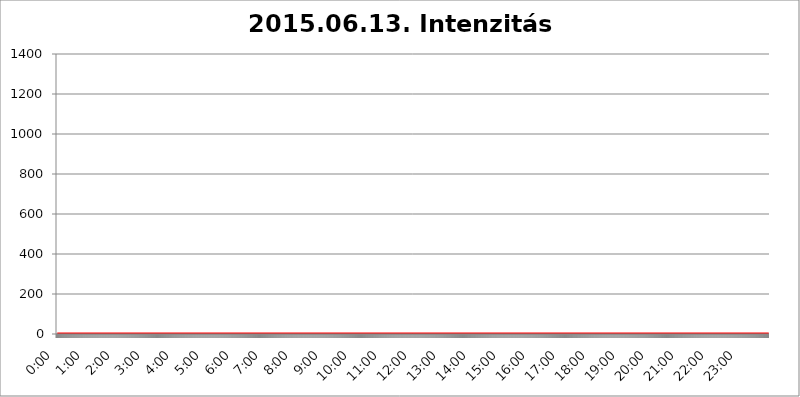
| Category | 2015.06.13. Intenzitás [W/m^2] |
|---|---|
| 0.0 | 0 |
| 0.0006944444444444445 | 0 |
| 0.001388888888888889 | 0 |
| 0.0020833333333333333 | 0 |
| 0.002777777777777778 | 0 |
| 0.003472222222222222 | 0 |
| 0.004166666666666667 | 0 |
| 0.004861111111111111 | 0 |
| 0.005555555555555556 | 0 |
| 0.0062499999999999995 | 0 |
| 0.006944444444444444 | 0 |
| 0.007638888888888889 | 0 |
| 0.008333333333333333 | 0 |
| 0.009027777777777779 | 0 |
| 0.009722222222222222 | 0 |
| 0.010416666666666666 | 0 |
| 0.011111111111111112 | 0 |
| 0.011805555555555555 | 0 |
| 0.012499999999999999 | 0 |
| 0.013194444444444444 | 0 |
| 0.013888888888888888 | 0 |
| 0.014583333333333332 | 0 |
| 0.015277777777777777 | 0 |
| 0.015972222222222224 | 0 |
| 0.016666666666666666 | 0 |
| 0.017361111111111112 | 0 |
| 0.018055555555555557 | 0 |
| 0.01875 | 0 |
| 0.019444444444444445 | 0 |
| 0.02013888888888889 | 0 |
| 0.020833333333333332 | 0 |
| 0.02152777777777778 | 0 |
| 0.022222222222222223 | 0 |
| 0.02291666666666667 | 0 |
| 0.02361111111111111 | 0 |
| 0.024305555555555556 | 0 |
| 0.024999999999999998 | 0 |
| 0.025694444444444447 | 0 |
| 0.02638888888888889 | 0 |
| 0.027083333333333334 | 0 |
| 0.027777777777777776 | 0 |
| 0.02847222222222222 | 0 |
| 0.029166666666666664 | 0 |
| 0.029861111111111113 | 0 |
| 0.030555555555555555 | 0 |
| 0.03125 | 0 |
| 0.03194444444444445 | 0 |
| 0.03263888888888889 | 0 |
| 0.03333333333333333 | 0 |
| 0.034027777777777775 | 0 |
| 0.034722222222222224 | 0 |
| 0.035416666666666666 | 0 |
| 0.036111111111111115 | 0 |
| 0.03680555555555556 | 0 |
| 0.0375 | 0 |
| 0.03819444444444444 | 0 |
| 0.03888888888888889 | 0 |
| 0.03958333333333333 | 0 |
| 0.04027777777777778 | 0 |
| 0.04097222222222222 | 0 |
| 0.041666666666666664 | 0 |
| 0.042361111111111106 | 0 |
| 0.04305555555555556 | 0 |
| 0.043750000000000004 | 0 |
| 0.044444444444444446 | 0 |
| 0.04513888888888889 | 0 |
| 0.04583333333333334 | 0 |
| 0.04652777777777778 | 0 |
| 0.04722222222222222 | 0 |
| 0.04791666666666666 | 0 |
| 0.04861111111111111 | 0 |
| 0.049305555555555554 | 0 |
| 0.049999999999999996 | 0 |
| 0.05069444444444445 | 0 |
| 0.051388888888888894 | 0 |
| 0.052083333333333336 | 0 |
| 0.05277777777777778 | 0 |
| 0.05347222222222222 | 0 |
| 0.05416666666666667 | 0 |
| 0.05486111111111111 | 0 |
| 0.05555555555555555 | 0 |
| 0.05625 | 0 |
| 0.05694444444444444 | 0 |
| 0.057638888888888885 | 0 |
| 0.05833333333333333 | 0 |
| 0.05902777777777778 | 0 |
| 0.059722222222222225 | 0 |
| 0.06041666666666667 | 0 |
| 0.061111111111111116 | 0 |
| 0.06180555555555556 | 0 |
| 0.0625 | 0 |
| 0.06319444444444444 | 0 |
| 0.06388888888888888 | 0 |
| 0.06458333333333334 | 0 |
| 0.06527777777777778 | 0 |
| 0.06597222222222222 | 0 |
| 0.06666666666666667 | 0 |
| 0.06736111111111111 | 0 |
| 0.06805555555555555 | 0 |
| 0.06874999999999999 | 0 |
| 0.06944444444444443 | 0 |
| 0.07013888888888889 | 0 |
| 0.07083333333333333 | 0 |
| 0.07152777777777779 | 0 |
| 0.07222222222222223 | 0 |
| 0.07291666666666667 | 0 |
| 0.07361111111111111 | 0 |
| 0.07430555555555556 | 0 |
| 0.075 | 0 |
| 0.07569444444444444 | 0 |
| 0.0763888888888889 | 0 |
| 0.07708333333333334 | 0 |
| 0.07777777777777778 | 0 |
| 0.07847222222222222 | 0 |
| 0.07916666666666666 | 0 |
| 0.0798611111111111 | 0 |
| 0.08055555555555556 | 0 |
| 0.08125 | 0 |
| 0.08194444444444444 | 0 |
| 0.08263888888888889 | 0 |
| 0.08333333333333333 | 0 |
| 0.08402777777777777 | 0 |
| 0.08472222222222221 | 0 |
| 0.08541666666666665 | 0 |
| 0.08611111111111112 | 0 |
| 0.08680555555555557 | 0 |
| 0.08750000000000001 | 0 |
| 0.08819444444444445 | 0 |
| 0.08888888888888889 | 0 |
| 0.08958333333333333 | 0 |
| 0.09027777777777778 | 0 |
| 0.09097222222222222 | 0 |
| 0.09166666666666667 | 0 |
| 0.09236111111111112 | 0 |
| 0.09305555555555556 | 0 |
| 0.09375 | 0 |
| 0.09444444444444444 | 0 |
| 0.09513888888888888 | 0 |
| 0.09583333333333333 | 0 |
| 0.09652777777777777 | 0 |
| 0.09722222222222222 | 0 |
| 0.09791666666666667 | 0 |
| 0.09861111111111111 | 0 |
| 0.09930555555555555 | 0 |
| 0.09999999999999999 | 0 |
| 0.10069444444444443 | 0 |
| 0.1013888888888889 | 0 |
| 0.10208333333333335 | 0 |
| 0.10277777777777779 | 0 |
| 0.10347222222222223 | 0 |
| 0.10416666666666667 | 0 |
| 0.10486111111111111 | 0 |
| 0.10555555555555556 | 0 |
| 0.10625 | 0 |
| 0.10694444444444444 | 0 |
| 0.1076388888888889 | 0 |
| 0.10833333333333334 | 0 |
| 0.10902777777777778 | 0 |
| 0.10972222222222222 | 0 |
| 0.1111111111111111 | 0 |
| 0.11180555555555556 | 0 |
| 0.11180555555555556 | 0 |
| 0.1125 | 0 |
| 0.11319444444444444 | 0 |
| 0.11388888888888889 | 0 |
| 0.11458333333333333 | 0 |
| 0.11527777777777777 | 0 |
| 0.11597222222222221 | 0 |
| 0.11666666666666665 | 0 |
| 0.1173611111111111 | 0 |
| 0.11805555555555557 | 0 |
| 0.11944444444444445 | 0 |
| 0.12013888888888889 | 0 |
| 0.12083333333333333 | 0 |
| 0.12152777777777778 | 0 |
| 0.12222222222222223 | 0 |
| 0.12291666666666667 | 0 |
| 0.12291666666666667 | 0 |
| 0.12361111111111112 | 0 |
| 0.12430555555555556 | 0 |
| 0.125 | 0 |
| 0.12569444444444444 | 0 |
| 0.12638888888888888 | 0 |
| 0.12708333333333333 | 0 |
| 0.16875 | 0 |
| 0.12847222222222224 | 0 |
| 0.12916666666666668 | 0 |
| 0.12986111111111112 | 0 |
| 0.13055555555555556 | 0 |
| 0.13125 | 0 |
| 0.13194444444444445 | 0 |
| 0.1326388888888889 | 0 |
| 0.13333333333333333 | 0 |
| 0.13402777777777777 | 0 |
| 0.13402777777777777 | 0 |
| 0.13472222222222222 | 0 |
| 0.13541666666666666 | 0 |
| 0.1361111111111111 | 0 |
| 0.13749999999999998 | 0 |
| 0.13819444444444443 | 0 |
| 0.1388888888888889 | 0 |
| 0.13958333333333334 | 0 |
| 0.14027777777777778 | 0 |
| 0.14097222222222222 | 0 |
| 0.14166666666666666 | 0 |
| 0.1423611111111111 | 0 |
| 0.14305555555555557 | 0 |
| 0.14375000000000002 | 0 |
| 0.14444444444444446 | 0 |
| 0.1451388888888889 | 0 |
| 0.1451388888888889 | 0 |
| 0.14652777777777778 | 0 |
| 0.14722222222222223 | 0 |
| 0.14791666666666667 | 0 |
| 0.1486111111111111 | 0 |
| 0.14930555555555555 | 0 |
| 0.15 | 0 |
| 0.15069444444444444 | 0 |
| 0.15138888888888888 | 0 |
| 0.15208333333333332 | 0 |
| 0.15277777777777776 | 0 |
| 0.15347222222222223 | 0 |
| 0.15416666666666667 | 0 |
| 0.15486111111111112 | 0 |
| 0.15555555555555556 | 0 |
| 0.15625 | 0 |
| 0.15694444444444444 | 0 |
| 0.15763888888888888 | 0 |
| 0.15833333333333333 | 0 |
| 0.15902777777777777 | 0 |
| 0.15972222222222224 | 0 |
| 0.16041666666666668 | 0 |
| 0.16111111111111112 | 0 |
| 0.16180555555555556 | 0 |
| 0.1625 | 0 |
| 0.16319444444444445 | 0 |
| 0.1638888888888889 | 0 |
| 0.16458333333333333 | 0 |
| 0.16527777777777777 | 0 |
| 0.16597222222222222 | 0 |
| 0.16666666666666666 | 0 |
| 0.1673611111111111 | 0 |
| 0.16805555555555554 | 0 |
| 0.16874999999999998 | 0 |
| 0.16944444444444443 | 0 |
| 0.17013888888888887 | 0 |
| 0.1708333333333333 | 0 |
| 0.17152777777777775 | 0 |
| 0.17222222222222225 | 0 |
| 0.1729166666666667 | 0 |
| 0.17361111111111113 | 0 |
| 0.17430555555555557 | 0 |
| 0.17500000000000002 | 0 |
| 0.17569444444444446 | 0 |
| 0.1763888888888889 | 0 |
| 0.17708333333333334 | 0 |
| 0.17777777777777778 | 0 |
| 0.17847222222222223 | 0 |
| 0.17916666666666667 | 0 |
| 0.1798611111111111 | 0 |
| 0.18055555555555555 | 0 |
| 0.18125 | 0 |
| 0.18194444444444444 | 0 |
| 0.1826388888888889 | 0 |
| 0.18333333333333335 | 0 |
| 0.1840277777777778 | 0 |
| 0.18472222222222223 | 0 |
| 0.18541666666666667 | 0 |
| 0.18611111111111112 | 0 |
| 0.18680555555555556 | 0 |
| 0.1875 | 0 |
| 0.18819444444444444 | 0 |
| 0.18888888888888888 | 0 |
| 0.18958333333333333 | 0 |
| 0.19027777777777777 | 0 |
| 0.1909722222222222 | 0 |
| 0.19166666666666665 | 0 |
| 0.19236111111111112 | 0 |
| 0.19305555555555554 | 0 |
| 0.19375 | 0 |
| 0.19444444444444445 | 0 |
| 0.1951388888888889 | 0 |
| 0.19583333333333333 | 0 |
| 0.19652777777777777 | 0 |
| 0.19722222222222222 | 0 |
| 0.19791666666666666 | 0 |
| 0.1986111111111111 | 0 |
| 0.19930555555555554 | 0 |
| 0.19999999999999998 | 0 |
| 0.20069444444444443 | 0 |
| 0.20138888888888887 | 0 |
| 0.2020833333333333 | 0 |
| 0.2027777777777778 | 0 |
| 0.2034722222222222 | 0 |
| 0.2041666666666667 | 0 |
| 0.20486111111111113 | 0 |
| 0.20555555555555557 | 0 |
| 0.20625000000000002 | 0 |
| 0.20694444444444446 | 0 |
| 0.2076388888888889 | 0 |
| 0.20833333333333334 | 0 |
| 0.20902777777777778 | 0 |
| 0.20972222222222223 | 0 |
| 0.21041666666666667 | 0 |
| 0.2111111111111111 | 0 |
| 0.21180555555555555 | 0 |
| 0.2125 | 0 |
| 0.21319444444444444 | 0 |
| 0.2138888888888889 | 0 |
| 0.21458333333333335 | 0 |
| 0.2152777777777778 | 0 |
| 0.21597222222222223 | 0 |
| 0.21666666666666667 | 0 |
| 0.21736111111111112 | 0 |
| 0.21805555555555556 | 0 |
| 0.21875 | 0 |
| 0.21944444444444444 | 0 |
| 0.22013888888888888 | 0 |
| 0.22083333333333333 | 0 |
| 0.22152777777777777 | 0 |
| 0.2222222222222222 | 0 |
| 0.22291666666666665 | 0 |
| 0.2236111111111111 | 0 |
| 0.22430555555555556 | 0 |
| 0.225 | 0 |
| 0.22569444444444445 | 0 |
| 0.2263888888888889 | 0 |
| 0.22708333333333333 | 0 |
| 0.22777777777777777 | 0 |
| 0.22847222222222222 | 0 |
| 0.22916666666666666 | 0 |
| 0.2298611111111111 | 0 |
| 0.23055555555555554 | 0 |
| 0.23124999999999998 | 0 |
| 0.23194444444444443 | 0 |
| 0.23263888888888887 | 0 |
| 0.2333333333333333 | 0 |
| 0.2340277777777778 | 0 |
| 0.2347222222222222 | 0 |
| 0.2354166666666667 | 0 |
| 0.23611111111111113 | 0 |
| 0.23680555555555557 | 0 |
| 0.23750000000000002 | 0 |
| 0.23819444444444446 | 0 |
| 0.2388888888888889 | 0 |
| 0.23958333333333334 | 0 |
| 0.24027777777777778 | 0 |
| 0.24097222222222223 | 0 |
| 0.24166666666666667 | 0 |
| 0.2423611111111111 | 0 |
| 0.24305555555555555 | 0 |
| 0.24375 | 0 |
| 0.24444444444444446 | 0 |
| 0.24513888888888888 | 0 |
| 0.24583333333333335 | 0 |
| 0.2465277777777778 | 0 |
| 0.24722222222222223 | 0 |
| 0.24791666666666667 | 0 |
| 0.24861111111111112 | 0 |
| 0.24930555555555556 | 0 |
| 0.25 | 0 |
| 0.25069444444444444 | 0 |
| 0.2513888888888889 | 0 |
| 0.2520833333333333 | 0 |
| 0.25277777777777777 | 0 |
| 0.2534722222222222 | 0 |
| 0.25416666666666665 | 0 |
| 0.2548611111111111 | 0 |
| 0.2555555555555556 | 0 |
| 0.25625000000000003 | 0 |
| 0.2569444444444445 | 0 |
| 0.2576388888888889 | 0 |
| 0.25833333333333336 | 0 |
| 0.2590277777777778 | 0 |
| 0.25972222222222224 | 0 |
| 0.2604166666666667 | 0 |
| 0.2611111111111111 | 0 |
| 0.26180555555555557 | 0 |
| 0.2625 | 0 |
| 0.26319444444444445 | 0 |
| 0.2638888888888889 | 0 |
| 0.26458333333333334 | 0 |
| 0.2652777777777778 | 0 |
| 0.2659722222222222 | 0 |
| 0.26666666666666666 | 0 |
| 0.2673611111111111 | 0 |
| 0.26805555555555555 | 0 |
| 0.26875 | 0 |
| 0.26944444444444443 | 0 |
| 0.2701388888888889 | 0 |
| 0.2708333333333333 | 0 |
| 0.27152777777777776 | 0 |
| 0.2722222222222222 | 0 |
| 0.27291666666666664 | 0 |
| 0.2736111111111111 | 0 |
| 0.2743055555555555 | 0 |
| 0.27499999999999997 | 0 |
| 0.27569444444444446 | 0 |
| 0.27638888888888885 | 0 |
| 0.27708333333333335 | 0 |
| 0.2777777777777778 | 0 |
| 0.27847222222222223 | 0 |
| 0.2791666666666667 | 0 |
| 0.2798611111111111 | 0 |
| 0.28055555555555556 | 0 |
| 0.28125 | 0 |
| 0.28194444444444444 | 0 |
| 0.2826388888888889 | 0 |
| 0.2833333333333333 | 0 |
| 0.28402777777777777 | 0 |
| 0.2847222222222222 | 0 |
| 0.28541666666666665 | 0 |
| 0.28611111111111115 | 0 |
| 0.28680555555555554 | 0 |
| 0.28750000000000003 | 0 |
| 0.2881944444444445 | 0 |
| 0.2888888888888889 | 0 |
| 0.28958333333333336 | 0 |
| 0.2902777777777778 | 0 |
| 0.29097222222222224 | 0 |
| 0.2916666666666667 | 0 |
| 0.2923611111111111 | 0 |
| 0.29305555555555557 | 0 |
| 0.29375 | 0 |
| 0.29444444444444445 | 0 |
| 0.2951388888888889 | 0 |
| 0.29583333333333334 | 0 |
| 0.2965277777777778 | 0 |
| 0.2972222222222222 | 0 |
| 0.29791666666666666 | 0 |
| 0.2986111111111111 | 0 |
| 0.29930555555555555 | 0 |
| 0.3 | 0 |
| 0.30069444444444443 | 0 |
| 0.3013888888888889 | 0 |
| 0.3020833333333333 | 0 |
| 0.30277777777777776 | 0 |
| 0.3034722222222222 | 0 |
| 0.30416666666666664 | 0 |
| 0.3048611111111111 | 0 |
| 0.3055555555555555 | 0 |
| 0.30624999999999997 | 0 |
| 0.3069444444444444 | 0 |
| 0.3076388888888889 | 0 |
| 0.30833333333333335 | 0 |
| 0.3090277777777778 | 0 |
| 0.30972222222222223 | 0 |
| 0.3104166666666667 | 0 |
| 0.3111111111111111 | 0 |
| 0.31180555555555556 | 0 |
| 0.3125 | 0 |
| 0.31319444444444444 | 0 |
| 0.3138888888888889 | 0 |
| 0.3145833333333333 | 0 |
| 0.31527777777777777 | 0 |
| 0.3159722222222222 | 0 |
| 0.31666666666666665 | 0 |
| 0.31736111111111115 | 0 |
| 0.31805555555555554 | 0 |
| 0.31875000000000003 | 0 |
| 0.3194444444444445 | 0 |
| 0.3201388888888889 | 0 |
| 0.32083333333333336 | 0 |
| 0.3215277777777778 | 0 |
| 0.32222222222222224 | 0 |
| 0.3229166666666667 | 0 |
| 0.3236111111111111 | 0 |
| 0.32430555555555557 | 0 |
| 0.325 | 0 |
| 0.32569444444444445 | 0 |
| 0.3263888888888889 | 0 |
| 0.32708333333333334 | 0 |
| 0.3277777777777778 | 0 |
| 0.3284722222222222 | 0 |
| 0.32916666666666666 | 0 |
| 0.3298611111111111 | 0 |
| 0.33055555555555555 | 0 |
| 0.33125 | 0 |
| 0.33194444444444443 | 0 |
| 0.3326388888888889 | 0 |
| 0.3333333333333333 | 0 |
| 0.3340277777777778 | 0 |
| 0.3347222222222222 | 0 |
| 0.3354166666666667 | 0 |
| 0.3361111111111111 | 0 |
| 0.3368055555555556 | 0 |
| 0.33749999999999997 | 0 |
| 0.33819444444444446 | 0 |
| 0.33888888888888885 | 0 |
| 0.33958333333333335 | 0 |
| 0.34027777777777773 | 0 |
| 0.34097222222222223 | 0 |
| 0.3416666666666666 | 0 |
| 0.3423611111111111 | 0 |
| 0.3430555555555555 | 0 |
| 0.34375 | 0 |
| 0.3444444444444445 | 0 |
| 0.3451388888888889 | 0 |
| 0.3458333333333334 | 0 |
| 0.34652777777777777 | 0 |
| 0.34722222222222227 | 0 |
| 0.34791666666666665 | 0 |
| 0.34861111111111115 | 0 |
| 0.34930555555555554 | 0 |
| 0.35000000000000003 | 0 |
| 0.3506944444444444 | 0 |
| 0.3513888888888889 | 0 |
| 0.3520833333333333 | 0 |
| 0.3527777777777778 | 0 |
| 0.3534722222222222 | 0 |
| 0.3541666666666667 | 0 |
| 0.3548611111111111 | 0 |
| 0.35555555555555557 | 0 |
| 0.35625 | 0 |
| 0.35694444444444445 | 0 |
| 0.3576388888888889 | 0 |
| 0.35833333333333334 | 0 |
| 0.3590277777777778 | 0 |
| 0.3597222222222222 | 0 |
| 0.36041666666666666 | 0 |
| 0.3611111111111111 | 0 |
| 0.36180555555555555 | 0 |
| 0.3625 | 0 |
| 0.36319444444444443 | 0 |
| 0.3638888888888889 | 0 |
| 0.3645833333333333 | 0 |
| 0.3652777777777778 | 0 |
| 0.3659722222222222 | 0 |
| 0.3666666666666667 | 0 |
| 0.3673611111111111 | 0 |
| 0.3680555555555556 | 0 |
| 0.36874999999999997 | 0 |
| 0.36944444444444446 | 0 |
| 0.37013888888888885 | 0 |
| 0.37083333333333335 | 0 |
| 0.37152777777777773 | 0 |
| 0.37222222222222223 | 0 |
| 0.3729166666666666 | 0 |
| 0.3736111111111111 | 0 |
| 0.3743055555555555 | 0 |
| 0.375 | 0 |
| 0.3756944444444445 | 0 |
| 0.3763888888888889 | 0 |
| 0.3770833333333334 | 0 |
| 0.37777777777777777 | 0 |
| 0.37847222222222227 | 0 |
| 0.37916666666666665 | 0 |
| 0.37986111111111115 | 0 |
| 0.38055555555555554 | 0 |
| 0.38125000000000003 | 0 |
| 0.3819444444444444 | 0 |
| 0.3826388888888889 | 0 |
| 0.3833333333333333 | 0 |
| 0.3840277777777778 | 0 |
| 0.3847222222222222 | 0 |
| 0.3854166666666667 | 0 |
| 0.3861111111111111 | 0 |
| 0.38680555555555557 | 0 |
| 0.3875 | 0 |
| 0.38819444444444445 | 0 |
| 0.3888888888888889 | 0 |
| 0.38958333333333334 | 0 |
| 0.3902777777777778 | 0 |
| 0.3909722222222222 | 0 |
| 0.39166666666666666 | 0 |
| 0.3923611111111111 | 0 |
| 0.39305555555555555 | 0 |
| 0.39375 | 0 |
| 0.39444444444444443 | 0 |
| 0.3951388888888889 | 0 |
| 0.3958333333333333 | 0 |
| 0.3965277777777778 | 0 |
| 0.3972222222222222 | 0 |
| 0.3979166666666667 | 0 |
| 0.3986111111111111 | 0 |
| 0.3993055555555556 | 0 |
| 0.39999999999999997 | 0 |
| 0.40069444444444446 | 0 |
| 0.40138888888888885 | 0 |
| 0.40208333333333335 | 0 |
| 0.40277777777777773 | 0 |
| 0.40347222222222223 | 0 |
| 0.4041666666666666 | 0 |
| 0.4048611111111111 | 0 |
| 0.4055555555555555 | 0 |
| 0.40625 | 0 |
| 0.4069444444444445 | 0 |
| 0.4076388888888889 | 0 |
| 0.4083333333333334 | 0 |
| 0.40902777777777777 | 0 |
| 0.40972222222222227 | 0 |
| 0.41041666666666665 | 0 |
| 0.41111111111111115 | 0 |
| 0.41180555555555554 | 0 |
| 0.41250000000000003 | 0 |
| 0.4131944444444444 | 0 |
| 0.4138888888888889 | 0 |
| 0.4145833333333333 | 0 |
| 0.4152777777777778 | 0 |
| 0.4159722222222222 | 0 |
| 0.4166666666666667 | 0 |
| 0.4173611111111111 | 0 |
| 0.41805555555555557 | 0 |
| 0.41875 | 0 |
| 0.41944444444444445 | 0 |
| 0.4201388888888889 | 0 |
| 0.42083333333333334 | 0 |
| 0.4215277777777778 | 0 |
| 0.4222222222222222 | 0 |
| 0.42291666666666666 | 0 |
| 0.4236111111111111 | 0 |
| 0.42430555555555555 | 0 |
| 0.425 | 0 |
| 0.42569444444444443 | 0 |
| 0.4263888888888889 | 0 |
| 0.4270833333333333 | 0 |
| 0.4277777777777778 | 0 |
| 0.4284722222222222 | 0 |
| 0.4291666666666667 | 0 |
| 0.4298611111111111 | 0 |
| 0.4305555555555556 | 0 |
| 0.43124999999999997 | 0 |
| 0.43194444444444446 | 0 |
| 0.43263888888888885 | 0 |
| 0.43333333333333335 | 0 |
| 0.43402777777777773 | 0 |
| 0.43472222222222223 | 0 |
| 0.4354166666666666 | 0 |
| 0.4361111111111111 | 0 |
| 0.4368055555555555 | 0 |
| 0.4375 | 0 |
| 0.4381944444444445 | 0 |
| 0.4388888888888889 | 0 |
| 0.4395833333333334 | 0 |
| 0.44027777777777777 | 0 |
| 0.44097222222222227 | 0 |
| 0.44166666666666665 | 0 |
| 0.44236111111111115 | 0 |
| 0.44305555555555554 | 0 |
| 0.44375000000000003 | 0 |
| 0.4444444444444444 | 0 |
| 0.4451388888888889 | 0 |
| 0.4458333333333333 | 0 |
| 0.4465277777777778 | 0 |
| 0.4472222222222222 | 0 |
| 0.4479166666666667 | 0 |
| 0.4486111111111111 | 0 |
| 0.44930555555555557 | 0 |
| 0.45 | 0 |
| 0.45069444444444445 | 0 |
| 0.4513888888888889 | 0 |
| 0.45208333333333334 | 0 |
| 0.4527777777777778 | 0 |
| 0.4534722222222222 | 0 |
| 0.45416666666666666 | 0 |
| 0.4548611111111111 | 0 |
| 0.45555555555555555 | 0 |
| 0.45625 | 0 |
| 0.45694444444444443 | 0 |
| 0.4576388888888889 | 0 |
| 0.4583333333333333 | 0 |
| 0.4590277777777778 | 0 |
| 0.4597222222222222 | 0 |
| 0.4604166666666667 | 0 |
| 0.4611111111111111 | 0 |
| 0.4618055555555556 | 0 |
| 0.46249999999999997 | 0 |
| 0.46319444444444446 | 0 |
| 0.46388888888888885 | 0 |
| 0.46458333333333335 | 0 |
| 0.46527777777777773 | 0 |
| 0.46597222222222223 | 0 |
| 0.4666666666666666 | 0 |
| 0.4673611111111111 | 0 |
| 0.4680555555555555 | 0 |
| 0.46875 | 0 |
| 0.4694444444444445 | 0 |
| 0.4701388888888889 | 0 |
| 0.4708333333333334 | 0 |
| 0.47152777777777777 | 0 |
| 0.47222222222222227 | 0 |
| 0.47291666666666665 | 0 |
| 0.47361111111111115 | 0 |
| 0.47430555555555554 | 0 |
| 0.47500000000000003 | 0 |
| 0.4756944444444444 | 0 |
| 0.4763888888888889 | 0 |
| 0.4770833333333333 | 0 |
| 0.4777777777777778 | 0 |
| 0.4784722222222222 | 0 |
| 0.4791666666666667 | 0 |
| 0.4798611111111111 | 0 |
| 0.48055555555555557 | 0 |
| 0.48125 | 0 |
| 0.48194444444444445 | 0 |
| 0.4826388888888889 | 0 |
| 0.48333333333333334 | 0 |
| 0.4840277777777778 | 0 |
| 0.4847222222222222 | 0 |
| 0.48541666666666666 | 0 |
| 0.4861111111111111 | 0 |
| 0.48680555555555555 | 0 |
| 0.4875 | 0 |
| 0.48819444444444443 | 0 |
| 0.4888888888888889 | 0 |
| 0.4895833333333333 | 0 |
| 0.4902777777777778 | 0 |
| 0.4909722222222222 | 0 |
| 0.4916666666666667 | 0 |
| 0.4923611111111111 | 0 |
| 0.4930555555555556 | 0 |
| 0.49374999999999997 | 0 |
| 0.49444444444444446 | 0 |
| 0.49513888888888885 | 0 |
| 0.49583333333333335 | 0 |
| 0.49652777777777773 | 0 |
| 0.49722222222222223 | 0 |
| 0.4979166666666666 | 0 |
| 0.4986111111111111 | 0 |
| 0.4993055555555555 | 0 |
| 0.5 | 0 |
| 0.5006944444444444 | 0 |
| 0.5013888888888889 | 0 |
| 0.5020833333333333 | 0 |
| 0.5027777777777778 | 0 |
| 0.5034722222222222 | 0 |
| 0.5041666666666667 | 0 |
| 0.5048611111111111 | 0 |
| 0.5055555555555555 | 0 |
| 0.50625 | 0 |
| 0.5069444444444444 | 0 |
| 0.5076388888888889 | 0 |
| 0.5083333333333333 | 0 |
| 0.5090277777777777 | 0 |
| 0.5097222222222222 | 0 |
| 0.5104166666666666 | 0 |
| 0.5111111111111112 | 0 |
| 0.5118055555555555 | 0 |
| 0.5125000000000001 | 0 |
| 0.5131944444444444 | 0 |
| 0.513888888888889 | 0 |
| 0.5145833333333333 | 0 |
| 0.5152777777777778 | 0 |
| 0.5159722222222222 | 0 |
| 0.5166666666666667 | 0 |
| 0.517361111111111 | 0 |
| 0.5180555555555556 | 0 |
| 0.5187499999999999 | 0 |
| 0.5194444444444445 | 0 |
| 0.5201388888888888 | 0 |
| 0.5208333333333334 | 0 |
| 0.5215277777777778 | 0 |
| 0.5222222222222223 | 0 |
| 0.5229166666666667 | 0 |
| 0.5236111111111111 | 0 |
| 0.5243055555555556 | 0 |
| 0.525 | 0 |
| 0.5256944444444445 | 0 |
| 0.5263888888888889 | 0 |
| 0.5270833333333333 | 0 |
| 0.5277777777777778 | 0 |
| 0.5284722222222222 | 0 |
| 0.5291666666666667 | 0 |
| 0.5298611111111111 | 0 |
| 0.5305555555555556 | 0 |
| 0.53125 | 0 |
| 0.5319444444444444 | 0 |
| 0.5326388888888889 | 0 |
| 0.5333333333333333 | 0 |
| 0.5340277777777778 | 0 |
| 0.5347222222222222 | 0 |
| 0.5354166666666667 | 0 |
| 0.5361111111111111 | 0 |
| 0.5368055555555555 | 0 |
| 0.5375 | 0 |
| 0.5381944444444444 | 0 |
| 0.5388888888888889 | 0 |
| 0.5395833333333333 | 0 |
| 0.5402777777777777 | 0 |
| 0.5409722222222222 | 0 |
| 0.5416666666666666 | 0 |
| 0.5423611111111112 | 0 |
| 0.5430555555555555 | 0 |
| 0.5437500000000001 | 0 |
| 0.5444444444444444 | 0 |
| 0.545138888888889 | 0 |
| 0.5458333333333333 | 0 |
| 0.5465277777777778 | 0 |
| 0.5472222222222222 | 0 |
| 0.5479166666666667 | 0 |
| 0.548611111111111 | 0 |
| 0.5493055555555556 | 0 |
| 0.5499999999999999 | 0 |
| 0.5506944444444445 | 0 |
| 0.5513888888888888 | 0 |
| 0.5520833333333334 | 0 |
| 0.5527777777777778 | 0 |
| 0.5534722222222223 | 0 |
| 0.5541666666666667 | 0 |
| 0.5548611111111111 | 0 |
| 0.5555555555555556 | 0 |
| 0.55625 | 0 |
| 0.5569444444444445 | 0 |
| 0.5576388888888889 | 0 |
| 0.5583333333333333 | 0 |
| 0.5590277777777778 | 0 |
| 0.5597222222222222 | 0 |
| 0.5604166666666667 | 0 |
| 0.5611111111111111 | 0 |
| 0.5618055555555556 | 0 |
| 0.5625 | 0 |
| 0.5631944444444444 | 0 |
| 0.5638888888888889 | 0 |
| 0.5645833333333333 | 0 |
| 0.5652777777777778 | 0 |
| 0.5659722222222222 | 0 |
| 0.5666666666666667 | 0 |
| 0.5673611111111111 | 0 |
| 0.5680555555555555 | 0 |
| 0.56875 | 0 |
| 0.5694444444444444 | 0 |
| 0.5701388888888889 | 0 |
| 0.5708333333333333 | 0 |
| 0.5715277777777777 | 0 |
| 0.5722222222222222 | 0 |
| 0.5729166666666666 | 0 |
| 0.5736111111111112 | 0 |
| 0.5743055555555555 | 0 |
| 0.5750000000000001 | 0 |
| 0.5756944444444444 | 0 |
| 0.576388888888889 | 0 |
| 0.5770833333333333 | 0 |
| 0.5777777777777778 | 0 |
| 0.5784722222222222 | 0 |
| 0.5791666666666667 | 0 |
| 0.579861111111111 | 0 |
| 0.5805555555555556 | 0 |
| 0.5812499999999999 | 0 |
| 0.5819444444444445 | 0 |
| 0.5826388888888888 | 0 |
| 0.5833333333333334 | 0 |
| 0.5840277777777778 | 0 |
| 0.5847222222222223 | 0 |
| 0.5854166666666667 | 0 |
| 0.5861111111111111 | 0 |
| 0.5868055555555556 | 0 |
| 0.5875 | 0 |
| 0.5881944444444445 | 0 |
| 0.5888888888888889 | 0 |
| 0.5895833333333333 | 0 |
| 0.5902777777777778 | 0 |
| 0.5909722222222222 | 0 |
| 0.5916666666666667 | 0 |
| 0.5923611111111111 | 0 |
| 0.5930555555555556 | 0 |
| 0.59375 | 0 |
| 0.5944444444444444 | 0 |
| 0.5951388888888889 | 0 |
| 0.5958333333333333 | 0 |
| 0.5965277777777778 | 0 |
| 0.5972222222222222 | 0 |
| 0.5979166666666667 | 0 |
| 0.5986111111111111 | 0 |
| 0.5993055555555555 | 0 |
| 0.6 | 0 |
| 0.6006944444444444 | 0 |
| 0.6013888888888889 | 0 |
| 0.6020833333333333 | 0 |
| 0.6027777777777777 | 0 |
| 0.6034722222222222 | 0 |
| 0.6041666666666666 | 0 |
| 0.6048611111111112 | 0 |
| 0.6055555555555555 | 0 |
| 0.6062500000000001 | 0 |
| 0.6069444444444444 | 0 |
| 0.607638888888889 | 0 |
| 0.6083333333333333 | 0 |
| 0.6090277777777778 | 0 |
| 0.6097222222222222 | 0 |
| 0.6104166666666667 | 0 |
| 0.611111111111111 | 0 |
| 0.6118055555555556 | 0 |
| 0.6124999999999999 | 0 |
| 0.6131944444444445 | 0 |
| 0.6138888888888888 | 0 |
| 0.6145833333333334 | 0 |
| 0.6152777777777778 | 0 |
| 0.6159722222222223 | 0 |
| 0.6166666666666667 | 0 |
| 0.6173611111111111 | 0 |
| 0.6180555555555556 | 0 |
| 0.61875 | 0 |
| 0.6194444444444445 | 0 |
| 0.6201388888888889 | 0 |
| 0.6208333333333333 | 0 |
| 0.6215277777777778 | 0 |
| 0.6222222222222222 | 0 |
| 0.6229166666666667 | 0 |
| 0.6236111111111111 | 0 |
| 0.6243055555555556 | 0 |
| 0.625 | 0 |
| 0.6256944444444444 | 0 |
| 0.6263888888888889 | 0 |
| 0.6270833333333333 | 0 |
| 0.6277777777777778 | 0 |
| 0.6284722222222222 | 0 |
| 0.6291666666666667 | 0 |
| 0.6298611111111111 | 0 |
| 0.6305555555555555 | 0 |
| 0.63125 | 0 |
| 0.6319444444444444 | 0 |
| 0.6326388888888889 | 0 |
| 0.6333333333333333 | 0 |
| 0.6340277777777777 | 0 |
| 0.6347222222222222 | 0 |
| 0.6354166666666666 | 0 |
| 0.6361111111111112 | 0 |
| 0.6368055555555555 | 0 |
| 0.6375000000000001 | 0 |
| 0.6381944444444444 | 0 |
| 0.638888888888889 | 0 |
| 0.6395833333333333 | 0 |
| 0.6402777777777778 | 0 |
| 0.6409722222222222 | 0 |
| 0.6416666666666667 | 0 |
| 0.642361111111111 | 0 |
| 0.6430555555555556 | 0 |
| 0.6437499999999999 | 0 |
| 0.6444444444444445 | 0 |
| 0.6451388888888888 | 0 |
| 0.6458333333333334 | 0 |
| 0.6465277777777778 | 0 |
| 0.6472222222222223 | 0 |
| 0.6479166666666667 | 0 |
| 0.6486111111111111 | 0 |
| 0.6493055555555556 | 0 |
| 0.65 | 0 |
| 0.6506944444444445 | 0 |
| 0.6513888888888889 | 0 |
| 0.6520833333333333 | 0 |
| 0.6527777777777778 | 0 |
| 0.6534722222222222 | 0 |
| 0.6541666666666667 | 0 |
| 0.6548611111111111 | 0 |
| 0.6555555555555556 | 0 |
| 0.65625 | 0 |
| 0.6569444444444444 | 0 |
| 0.6576388888888889 | 0 |
| 0.6583333333333333 | 0 |
| 0.6590277777777778 | 0 |
| 0.6597222222222222 | 0 |
| 0.6604166666666667 | 0 |
| 0.6611111111111111 | 0 |
| 0.6618055555555555 | 0 |
| 0.6625 | 0 |
| 0.6631944444444444 | 0 |
| 0.6638888888888889 | 0 |
| 0.6645833333333333 | 0 |
| 0.6652777777777777 | 0 |
| 0.6659722222222222 | 0 |
| 0.6666666666666666 | 0 |
| 0.6673611111111111 | 0 |
| 0.6680555555555556 | 0 |
| 0.6687500000000001 | 0 |
| 0.6694444444444444 | 0 |
| 0.6701388888888888 | 0 |
| 0.6708333333333334 | 0 |
| 0.6715277777777778 | 0 |
| 0.6722222222222222 | 0 |
| 0.6729166666666666 | 0 |
| 0.6736111111111112 | 0 |
| 0.6743055555555556 | 0 |
| 0.6749999999999999 | 0 |
| 0.6756944444444444 | 0 |
| 0.6763888888888889 | 0 |
| 0.6770833333333334 | 0 |
| 0.6777777777777777 | 0 |
| 0.6784722222222223 | 0 |
| 0.6791666666666667 | 0 |
| 0.6798611111111111 | 0 |
| 0.6805555555555555 | 0 |
| 0.68125 | 0 |
| 0.6819444444444445 | 0 |
| 0.6826388888888889 | 0 |
| 0.6833333333333332 | 0 |
| 0.6840277777777778 | 0 |
| 0.6847222222222222 | 0 |
| 0.6854166666666667 | 0 |
| 0.686111111111111 | 0 |
| 0.6868055555555556 | 0 |
| 0.6875 | 0 |
| 0.6881944444444444 | 0 |
| 0.688888888888889 | 0 |
| 0.6895833333333333 | 0 |
| 0.6902777777777778 | 0 |
| 0.6909722222222222 | 0 |
| 0.6916666666666668 | 0 |
| 0.6923611111111111 | 0 |
| 0.6930555555555555 | 0 |
| 0.69375 | 0 |
| 0.6944444444444445 | 0 |
| 0.6951388888888889 | 0 |
| 0.6958333333333333 | 0 |
| 0.6965277777777777 | 0 |
| 0.6972222222222223 | 0 |
| 0.6979166666666666 | 0 |
| 0.6986111111111111 | 0 |
| 0.6993055555555556 | 0 |
| 0.7000000000000001 | 0 |
| 0.7006944444444444 | 0 |
| 0.7013888888888888 | 0 |
| 0.7020833333333334 | 0 |
| 0.7027777777777778 | 0 |
| 0.7034722222222222 | 0 |
| 0.7041666666666666 | 0 |
| 0.7048611111111112 | 0 |
| 0.7055555555555556 | 0 |
| 0.7062499999999999 | 0 |
| 0.7069444444444444 | 0 |
| 0.7076388888888889 | 0 |
| 0.7083333333333334 | 0 |
| 0.7090277777777777 | 0 |
| 0.7097222222222223 | 0 |
| 0.7104166666666667 | 0 |
| 0.7111111111111111 | 0 |
| 0.7118055555555555 | 0 |
| 0.7125 | 0 |
| 0.7131944444444445 | 0 |
| 0.7138888888888889 | 0 |
| 0.7145833333333332 | 0 |
| 0.7152777777777778 | 0 |
| 0.7159722222222222 | 0 |
| 0.7166666666666667 | 0 |
| 0.717361111111111 | 0 |
| 0.7180555555555556 | 0 |
| 0.71875 | 0 |
| 0.7194444444444444 | 0 |
| 0.720138888888889 | 0 |
| 0.7208333333333333 | 0 |
| 0.7215277777777778 | 0 |
| 0.7222222222222222 | 0 |
| 0.7229166666666668 | 0 |
| 0.7236111111111111 | 0 |
| 0.7243055555555555 | 0 |
| 0.725 | 0 |
| 0.7256944444444445 | 0 |
| 0.7263888888888889 | 0 |
| 0.7270833333333333 | 0 |
| 0.7277777777777777 | 0 |
| 0.7284722222222223 | 0 |
| 0.7291666666666666 | 0 |
| 0.7298611111111111 | 0 |
| 0.7305555555555556 | 0 |
| 0.7312500000000001 | 0 |
| 0.7319444444444444 | 0 |
| 0.7326388888888888 | 0 |
| 0.7333333333333334 | 0 |
| 0.7340277777777778 | 0 |
| 0.7347222222222222 | 0 |
| 0.7354166666666666 | 0 |
| 0.7361111111111112 | 0 |
| 0.7368055555555556 | 0 |
| 0.7374999999999999 | 0 |
| 0.7381944444444444 | 0 |
| 0.7388888888888889 | 0 |
| 0.7395833333333334 | 0 |
| 0.7402777777777777 | 0 |
| 0.7409722222222223 | 0 |
| 0.7416666666666667 | 0 |
| 0.7423611111111111 | 0 |
| 0.7430555555555555 | 0 |
| 0.74375 | 0 |
| 0.7444444444444445 | 0 |
| 0.7451388888888889 | 0 |
| 0.7458333333333332 | 0 |
| 0.7465277777777778 | 0 |
| 0.7472222222222222 | 0 |
| 0.7479166666666667 | 0 |
| 0.748611111111111 | 0 |
| 0.7493055555555556 | 0 |
| 0.75 | 0 |
| 0.7506944444444444 | 0 |
| 0.751388888888889 | 0 |
| 0.7520833333333333 | 0 |
| 0.7527777777777778 | 0 |
| 0.7534722222222222 | 0 |
| 0.7541666666666668 | 0 |
| 0.7548611111111111 | 0 |
| 0.7555555555555555 | 0 |
| 0.75625 | 0 |
| 0.7569444444444445 | 0 |
| 0.7576388888888889 | 0 |
| 0.7583333333333333 | 0 |
| 0.7590277777777777 | 0 |
| 0.7597222222222223 | 0 |
| 0.7604166666666666 | 0 |
| 0.7611111111111111 | 0 |
| 0.7618055555555556 | 0 |
| 0.7625000000000001 | 0 |
| 0.7631944444444444 | 0 |
| 0.7638888888888888 | 0 |
| 0.7645833333333334 | 0 |
| 0.7652777777777778 | 0 |
| 0.7659722222222222 | 0 |
| 0.7666666666666666 | 0 |
| 0.7673611111111112 | 0 |
| 0.7680555555555556 | 0 |
| 0.7687499999999999 | 0 |
| 0.7694444444444444 | 0 |
| 0.7701388888888889 | 0 |
| 0.7708333333333334 | 0 |
| 0.7715277777777777 | 0 |
| 0.7722222222222223 | 0 |
| 0.7729166666666667 | 0 |
| 0.7736111111111111 | 0 |
| 0.7743055555555555 | 0 |
| 0.775 | 0 |
| 0.7756944444444445 | 0 |
| 0.7763888888888889 | 0 |
| 0.7770833333333332 | 0 |
| 0.7777777777777778 | 0 |
| 0.7784722222222222 | 0 |
| 0.7791666666666667 | 0 |
| 0.779861111111111 | 0 |
| 0.7805555555555556 | 0 |
| 0.78125 | 0 |
| 0.7819444444444444 | 0 |
| 0.782638888888889 | 0 |
| 0.7833333333333333 | 0 |
| 0.7840277777777778 | 0 |
| 0.7847222222222222 | 0 |
| 0.7854166666666668 | 0 |
| 0.7861111111111111 | 0 |
| 0.7868055555555555 | 0 |
| 0.7875 | 0 |
| 0.7881944444444445 | 0 |
| 0.7888888888888889 | 0 |
| 0.7895833333333333 | 0 |
| 0.7902777777777777 | 0 |
| 0.7909722222222223 | 0 |
| 0.7916666666666666 | 0 |
| 0.7923611111111111 | 0 |
| 0.7930555555555556 | 0 |
| 0.7937500000000001 | 0 |
| 0.7944444444444444 | 0 |
| 0.7951388888888888 | 0 |
| 0.7958333333333334 | 0 |
| 0.7965277777777778 | 0 |
| 0.7972222222222222 | 0 |
| 0.7979166666666666 | 0 |
| 0.7986111111111112 | 0 |
| 0.7993055555555556 | 0 |
| 0.7999999999999999 | 0 |
| 0.8006944444444444 | 0 |
| 0.8013888888888889 | 0 |
| 0.8020833333333334 | 0 |
| 0.8027777777777777 | 0 |
| 0.8034722222222223 | 0 |
| 0.8041666666666667 | 0 |
| 0.8048611111111111 | 0 |
| 0.8055555555555555 | 0 |
| 0.80625 | 0 |
| 0.8069444444444445 | 0 |
| 0.8076388888888889 | 0 |
| 0.8083333333333332 | 0 |
| 0.8090277777777778 | 0 |
| 0.8097222222222222 | 0 |
| 0.8104166666666667 | 0 |
| 0.811111111111111 | 0 |
| 0.8118055555555556 | 0 |
| 0.8125 | 0 |
| 0.8131944444444444 | 0 |
| 0.813888888888889 | 0 |
| 0.8145833333333333 | 0 |
| 0.8152777777777778 | 0 |
| 0.8159722222222222 | 0 |
| 0.8166666666666668 | 0 |
| 0.8173611111111111 | 0 |
| 0.8180555555555555 | 0 |
| 0.81875 | 0 |
| 0.8194444444444445 | 0 |
| 0.8201388888888889 | 0 |
| 0.8208333333333333 | 0 |
| 0.8215277777777777 | 0 |
| 0.8222222222222223 | 0 |
| 0.8229166666666666 | 0 |
| 0.8236111111111111 | 0 |
| 0.8243055555555556 | 0 |
| 0.8250000000000001 | 0 |
| 0.8256944444444444 | 0 |
| 0.8263888888888888 | 0 |
| 0.8270833333333334 | 0 |
| 0.8277777777777778 | 0 |
| 0.8284722222222222 | 0 |
| 0.8291666666666666 | 0 |
| 0.8298611111111112 | 0 |
| 0.8305555555555556 | 0 |
| 0.8312499999999999 | 0 |
| 0.8319444444444444 | 0 |
| 0.8326388888888889 | 0 |
| 0.8333333333333334 | 0 |
| 0.8340277777777777 | 0 |
| 0.8347222222222223 | 0 |
| 0.8354166666666667 | 0 |
| 0.8361111111111111 | 0 |
| 0.8368055555555555 | 0 |
| 0.8375 | 0 |
| 0.8381944444444445 | 0 |
| 0.8388888888888889 | 0 |
| 0.8395833333333332 | 0 |
| 0.8402777777777778 | 0 |
| 0.8409722222222222 | 0 |
| 0.8416666666666667 | 0 |
| 0.842361111111111 | 0 |
| 0.8430555555555556 | 0 |
| 0.84375 | 0 |
| 0.8444444444444444 | 0 |
| 0.845138888888889 | 0 |
| 0.8458333333333333 | 0 |
| 0.8465277777777778 | 0 |
| 0.8472222222222222 | 0 |
| 0.8479166666666668 | 0 |
| 0.8486111111111111 | 0 |
| 0.8493055555555555 | 0 |
| 0.85 | 0 |
| 0.8506944444444445 | 0 |
| 0.8513888888888889 | 0 |
| 0.8520833333333333 | 0 |
| 0.8527777777777777 | 0 |
| 0.8534722222222223 | 0 |
| 0.8541666666666666 | 0 |
| 0.8548611111111111 | 0 |
| 0.8555555555555556 | 0 |
| 0.8562500000000001 | 0 |
| 0.8569444444444444 | 0 |
| 0.8576388888888888 | 0 |
| 0.8583333333333334 | 0 |
| 0.8590277777777778 | 0 |
| 0.8597222222222222 | 0 |
| 0.8604166666666666 | 0 |
| 0.8611111111111112 | 0 |
| 0.8618055555555556 | 0 |
| 0.8624999999999999 | 0 |
| 0.8631944444444444 | 0 |
| 0.8638888888888889 | 0 |
| 0.8645833333333334 | 0 |
| 0.8652777777777777 | 0 |
| 0.8659722222222223 | 0 |
| 0.8666666666666667 | 0 |
| 0.8673611111111111 | 0 |
| 0.8680555555555555 | 0 |
| 0.86875 | 0 |
| 0.8694444444444445 | 0 |
| 0.8701388888888889 | 0 |
| 0.8708333333333332 | 0 |
| 0.8715277777777778 | 0 |
| 0.8722222222222222 | 0 |
| 0.8729166666666667 | 0 |
| 0.873611111111111 | 0 |
| 0.8743055555555556 | 0 |
| 0.875 | 0 |
| 0.8756944444444444 | 0 |
| 0.876388888888889 | 0 |
| 0.8770833333333333 | 0 |
| 0.8777777777777778 | 0 |
| 0.8784722222222222 | 0 |
| 0.8791666666666668 | 0 |
| 0.8798611111111111 | 0 |
| 0.8805555555555555 | 0 |
| 0.88125 | 0 |
| 0.8819444444444445 | 0 |
| 0.8826388888888889 | 0 |
| 0.8833333333333333 | 0 |
| 0.8840277777777777 | 0 |
| 0.8847222222222223 | 0 |
| 0.8854166666666666 | 0 |
| 0.8861111111111111 | 0 |
| 0.8868055555555556 | 0 |
| 0.8875000000000001 | 0 |
| 0.8881944444444444 | 0 |
| 0.8888888888888888 | 0 |
| 0.8895833333333334 | 0 |
| 0.8902777777777778 | 0 |
| 0.8909722222222222 | 0 |
| 0.8916666666666666 | 0 |
| 0.8923611111111112 | 0 |
| 0.8930555555555556 | 0 |
| 0.8937499999999999 | 0 |
| 0.8944444444444444 | 0 |
| 0.8951388888888889 | 0 |
| 0.8958333333333334 | 0 |
| 0.8965277777777777 | 0 |
| 0.8972222222222223 | 0 |
| 0.8979166666666667 | 0 |
| 0.8986111111111111 | 0 |
| 0.8993055555555555 | 0 |
| 0.9 | 0 |
| 0.9006944444444445 | 0 |
| 0.9013888888888889 | 0 |
| 0.9020833333333332 | 0 |
| 0.9027777777777778 | 0 |
| 0.9034722222222222 | 0 |
| 0.9041666666666667 | 0 |
| 0.904861111111111 | 0 |
| 0.9055555555555556 | 0 |
| 0.90625 | 0 |
| 0.9069444444444444 | 0 |
| 0.907638888888889 | 0 |
| 0.9083333333333333 | 0 |
| 0.9090277777777778 | 0 |
| 0.9097222222222222 | 0 |
| 0.9104166666666668 | 0 |
| 0.9111111111111111 | 0 |
| 0.9118055555555555 | 0 |
| 0.9125 | 0 |
| 0.9131944444444445 | 0 |
| 0.9138888888888889 | 0 |
| 0.9145833333333333 | 0 |
| 0.9152777777777777 | 0 |
| 0.9159722222222223 | 0 |
| 0.9166666666666666 | 0 |
| 0.9173611111111111 | 0 |
| 0.9180555555555556 | 0 |
| 0.9187500000000001 | 0 |
| 0.9194444444444444 | 0 |
| 0.9201388888888888 | 0 |
| 0.9208333333333334 | 0 |
| 0.9215277777777778 | 0 |
| 0.9222222222222222 | 0 |
| 0.9229166666666666 | 0 |
| 0.9236111111111112 | 0 |
| 0.9243055555555556 | 0 |
| 0.9249999999999999 | 0 |
| 0.9256944444444444 | 0 |
| 0.9263888888888889 | 0 |
| 0.9270833333333334 | 0 |
| 0.9277777777777777 | 0 |
| 0.9284722222222223 | 0 |
| 0.9291666666666667 | 0 |
| 0.9298611111111111 | 0 |
| 0.9305555555555555 | 0 |
| 0.93125 | 0 |
| 0.9319444444444445 | 0 |
| 0.9326388888888889 | 0 |
| 0.9333333333333332 | 0 |
| 0.9340277777777778 | 0 |
| 0.9347222222222222 | 0 |
| 0.9354166666666667 | 0 |
| 0.936111111111111 | 0 |
| 0.9368055555555556 | 0 |
| 0.9375 | 0 |
| 0.9381944444444444 | 0 |
| 0.938888888888889 | 0 |
| 0.9395833333333333 | 0 |
| 0.9402777777777778 | 0 |
| 0.9409722222222222 | 0 |
| 0.9416666666666668 | 0 |
| 0.9423611111111111 | 0 |
| 0.9430555555555555 | 0 |
| 0.94375 | 0 |
| 0.9444444444444445 | 0 |
| 0.9451388888888889 | 0 |
| 0.9458333333333333 | 0 |
| 0.9465277777777777 | 0 |
| 0.9472222222222223 | 0 |
| 0.9479166666666666 | 0 |
| 0.9486111111111111 | 0 |
| 0.9493055555555556 | 0 |
| 0.9500000000000001 | 0 |
| 0.9506944444444444 | 0 |
| 0.9513888888888888 | 0 |
| 0.9520833333333334 | 0 |
| 0.9527777777777778 | 0 |
| 0.9534722222222222 | 0 |
| 0.9541666666666666 | 0 |
| 0.9548611111111112 | 0 |
| 0.9555555555555556 | 0 |
| 0.9562499999999999 | 0 |
| 0.9569444444444444 | 0 |
| 0.9576388888888889 | 0 |
| 0.9583333333333334 | 0 |
| 0.9590277777777777 | 0 |
| 0.9597222222222223 | 0 |
| 0.9604166666666667 | 0 |
| 0.9611111111111111 | 0 |
| 0.9618055555555555 | 0 |
| 0.9625 | 0 |
| 0.9631944444444445 | 0 |
| 0.9638888888888889 | 0 |
| 0.9645833333333332 | 0 |
| 0.9652777777777778 | 0 |
| 0.9659722222222222 | 0 |
| 0.9666666666666667 | 0 |
| 0.967361111111111 | 0 |
| 0.9680555555555556 | 0 |
| 0.96875 | 0 |
| 0.9694444444444444 | 0 |
| 0.970138888888889 | 0 |
| 0.9708333333333333 | 0 |
| 0.9715277777777778 | 0 |
| 0.9722222222222222 | 0 |
| 0.9729166666666668 | 0 |
| 0.9736111111111111 | 0 |
| 0.9743055555555555 | 0 |
| 0.975 | 0 |
| 0.9756944444444445 | 0 |
| 0.9763888888888889 | 0 |
| 0.9770833333333333 | 0 |
| 0.9777777777777777 | 0 |
| 0.9784722222222223 | 0 |
| 0.9791666666666666 | 0 |
| 0.9798611111111111 | 0 |
| 0.9805555555555556 | 0 |
| 0.9812500000000001 | 0 |
| 0.9819444444444444 | 0 |
| 0.9826388888888888 | 0 |
| 0.9833333333333334 | 0 |
| 0.9840277777777778 | 0 |
| 0.9847222222222222 | 0 |
| 0.9854166666666666 | 0 |
| 0.9861111111111112 | 0 |
| 0.9868055555555556 | 0 |
| 0.9874999999999999 | 0 |
| 0.9881944444444444 | 0 |
| 0.9888888888888889 | 0 |
| 0.9895833333333334 | 0 |
| 0.9902777777777777 | 0 |
| 0.9909722222222223 | 0 |
| 0.9916666666666667 | 0 |
| 0.9923611111111111 | 0 |
| 0.9930555555555555 | 0 |
| 0.99375 | 0 |
| 0.9944444444444445 | 0 |
| 0.9951388888888889 | 0 |
| 0.9958333333333332 | 0 |
| 0.9965277777777778 | 0 |
| 0.9972222222222222 | 0 |
| 0.9979166666666667 | 0 |
| 0.998611111111111 | 0 |
| 0.9993055555555556 | 0 |